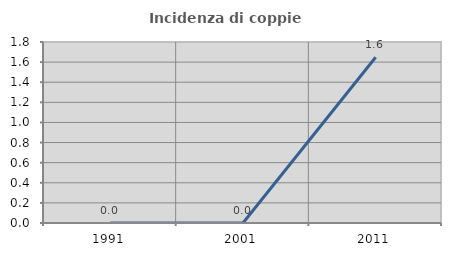
| Category | Incidenza di coppie miste |
|---|---|
| 1991.0 | 0 |
| 2001.0 | 0 |
| 2011.0 | 1.648 |